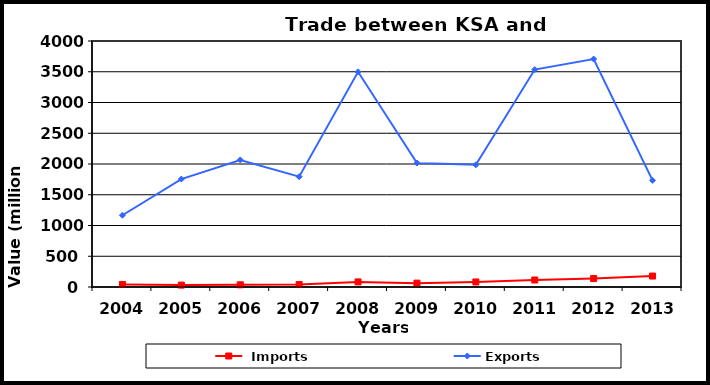
| Category |  Imports | Exports |
|---|---|---|
| 2004.0 | 42 | 1167 |
| 2005.0 | 31 | 1755 |
| 2006.0 | 36 | 2066 |
| 2007.0 | 40 | 1794 |
| 2008.0 | 83 | 3499 |
| 2009.0 | 63 | 2015 |
| 2010.0 | 82 | 1987 |
| 2011.0 | 114 | 3536 |
| 2012.0 | 137 | 3707 |
| 2013.0 | 178 | 1734 |